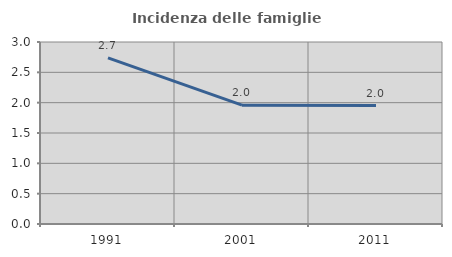
| Category | Incidenza delle famiglie numerose |
|---|---|
| 1991.0 | 2.739 |
| 2001.0 | 1.958 |
| 2011.0 | 1.952 |